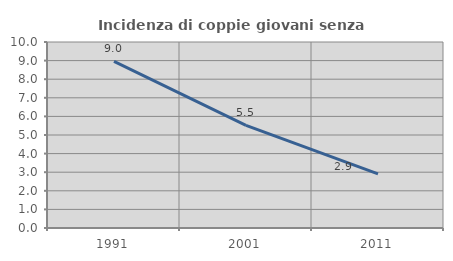
| Category | Incidenza di coppie giovani senza figli |
|---|---|
| 1991.0 | 8.957 |
| 2001.0 | 5.516 |
| 2011.0 | 2.915 |